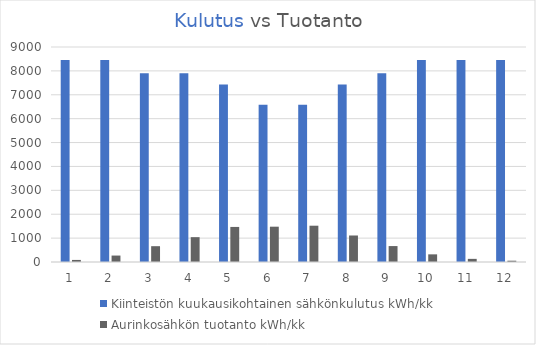
| Category | Kiinteistön kuukausikohtainen sähkönkulutus kWh/kk | Aurinkosähkön tuotanto kWh/kk |
|---|---|---|
| 0 | 8460 | 86.816 |
| 1 | 8460 | 269.549 |
| 2 | 7896 | 661.971 |
| 3 | 7896 | 1039.69 |
| 4 | 7426 | 1467.731 |
| 5 | 6580 | 1478.145 |
| 6 | 6580 | 1519.278 |
| 7 | 7426 | 1109.615 |
| 8 | 7896 | 666.872 |
| 9 | 8460 | 320.134 |
| 10 | 8460 | 131.274 |
| 11 | 8460 | 54.26 |